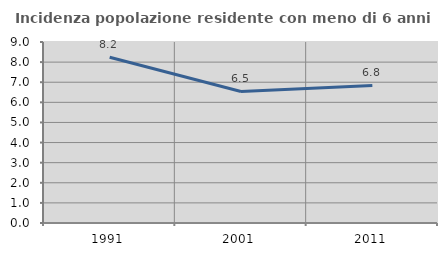
| Category | Incidenza popolazione residente con meno di 6 anni |
|---|---|
| 1991.0 | 8.245 |
| 2001.0 | 6.539 |
| 2011.0 | 6.842 |